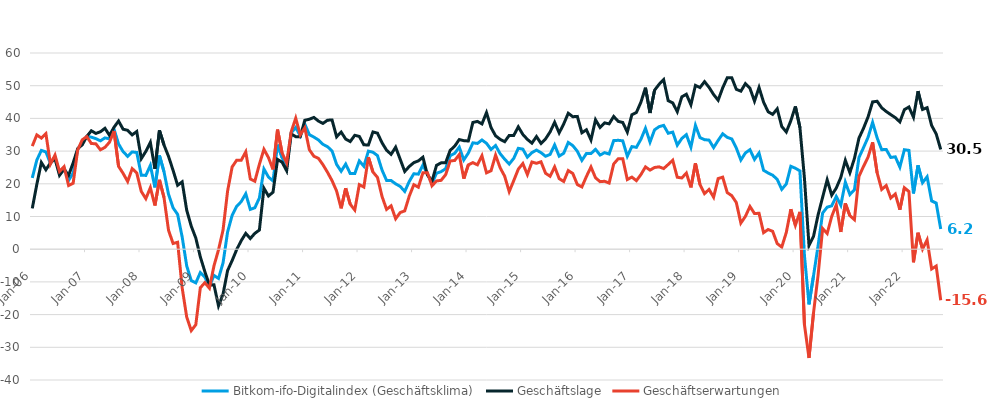
| Category | Bitkom-ifo-Digitalindex (Geschäftsklima) | Geschäftslage | Geschäftserwartungen |
|---|---|---|---|
| 2006-01-01 | 21.798 | 12.475 | 31.531 |
| 2006-02-01 | 27.246 | 19.795 | 34.949 |
| 2006-03-01 | 30.22 | 26.516 | 33.985 |
| 2006-04-01 | 29.742 | 24.293 | 35.324 |
| 2006-05-01 | 26.235 | 26.409 | 26.06 |
| 2006-06-01 | 28.215 | 27.647 | 28.783 |
| 2006-07-01 | 23.178 | 22.593 | 23.764 |
| 2006-08-01 | 24.837 | 24.431 | 25.243 |
| 2006-09-01 | 21.044 | 22.612 | 19.487 |
| 2006-10-01 | 23.27 | 26.41 | 20.173 |
| 2006-11-01 | 30.557 | 30.748 | 30.367 |
| 2006-12-01 | 32.67 | 31.902 | 33.441 |
| 2007-01-01 | 34.467 | 34.488 | 34.447 |
| 2007-02-01 | 34.269 | 36.221 | 32.333 |
| 2007-03-01 | 33.807 | 35.407 | 32.218 |
| 2007-04-01 | 33.143 | 35.918 | 30.4 |
| 2007-05-01 | 34.04 | 36.97 | 31.147 |
| 2007-06-01 | 33.769 | 34.821 | 32.722 |
| 2007-07-01 | 36.716 | 37.299 | 36.135 |
| 2007-08-01 | 32.166 | 39.199 | 25.34 |
| 2007-09-01 | 29.833 | 36.685 | 23.179 |
| 2007-10-01 | 28.4 | 36.363 | 20.705 |
| 2007-11-01 | 29.748 | 34.969 | 24.644 |
| 2007-12-01 | 29.58 | 35.993 | 23.342 |
| 2008-01-01 | 22.62 | 27.691 | 17.662 |
| 2008-02-01 | 22.567 | 29.915 | 15.454 |
| 2008-03-01 | 25.632 | 32.653 | 18.822 |
| 2008-04-01 | 18.898 | 24.578 | 13.361 |
| 2008-05-01 | 28.651 | 36.343 | 21.21 |
| 2008-06-01 | 23.702 | 31.879 | 15.813 |
| 2008-07-01 | 16.776 | 28.367 | 5.773 |
| 2008-08-01 | 12.643 | 24.124 | 1.751 |
| 2008-09-01 | 10.651 | 19.541 | 2.121 |
| 2008-10-01 | 3.747 | 20.599 | -11.817 |
| 2008-11-01 | -5.097 | 11.927 | -20.755 |
| 2008-12-01 | -9.595 | 7.057 | -24.908 |
| 2009-01-01 | -10.301 | 3.422 | -23.099 |
| 2009-02-01 | -7.13 | -2.361 | -11.785 |
| 2009-03-01 | -8.56 | -6.87 | -10.234 |
| 2009-04-01 | -11.459 | -10.992 | -11.925 |
| 2009-05-01 | -8.012 | -10.877 | -5.103 |
| 2009-06-01 | -8.952 | -17.325 | -0.195 |
| 2009-07-01 | -4.185 | -13.733 | 5.854 |
| 2009-08-01 | 5.256 | -6.537 | 17.767 |
| 2009-09-01 | 10.353 | -3.48 | 25.159 |
| 2009-10-01 | 13.109 | -0.123 | 27.216 |
| 2009-11-01 | 14.547 | 2.61 | 27.187 |
| 2009-12-01 | 16.95 | 4.835 | 29.78 |
| 2010-01-01 | 12.171 | 3.268 | 21.465 |
| 2010-02-01 | 12.673 | 4.853 | 20.793 |
| 2010-03-01 | 15.675 | 5.861 | 25.955 |
| 2010-04-01 | 24.522 | 18.649 | 30.552 |
| 2010-05-01 | 22.066 | 16.274 | 28.012 |
| 2010-06-01 | 20.885 | 17.426 | 24.399 |
| 2010-07-01 | 31.962 | 27.442 | 36.572 |
| 2010-08-01 | 28.025 | 26.616 | 29.443 |
| 2010-09-01 | 25.177 | 23.986 | 26.375 |
| 2010-10-01 | 35.56 | 35.244 | 35.878 |
| 2010-11-01 | 37.228 | 34.42 | 40.07 |
| 2010-12-01 | 34.677 | 34.408 | 34.946 |
| 2011-01-01 | 38.269 | 39.427 | 37.116 |
| 2011-02-01 | 35.034 | 39.741 | 30.419 |
| 2011-03-01 | 34.283 | 40.301 | 28.416 |
| 2011-04-01 | 33.409 | 39.175 | 27.782 |
| 2011-05-01 | 32.065 | 38.477 | 25.825 |
| 2011-06-01 | 31.345 | 39.455 | 23.509 |
| 2011-07-01 | 30.046 | 39.512 | 20.954 |
| 2011-08-01 | 25.93 | 34.371 | 17.792 |
| 2011-09-01 | 23.85 | 35.817 | 12.491 |
| 2011-10-01 | 26.031 | 33.678 | 18.634 |
| 2011-11-01 | 23.13 | 32.92 | 13.751 |
| 2011-12-01 | 23.115 | 34.834 | 11.981 |
| 2012-01-01 | 26.998 | 34.488 | 19.747 |
| 2012-02-01 | 25.369 | 31.919 | 19.004 |
| 2012-03-01 | 29.993 | 31.872 | 28.129 |
| 2012-04-01 | 29.65 | 35.857 | 23.607 |
| 2012-05-01 | 28.618 | 35.48 | 21.956 |
| 2012-06-01 | 24.197 | 32.551 | 16.144 |
| 2012-07-01 | 21.036 | 30.267 | 12.174 |
| 2012-08-01 | 21.002 | 29.015 | 13.269 |
| 2012-09-01 | 19.983 | 31.203 | 9.307 |
| 2012-10-01 | 19.201 | 27.488 | 11.216 |
| 2012-11-01 | 17.668 | 23.778 | 11.725 |
| 2012-12-01 | 20.734 | 25.304 | 16.256 |
| 2013-01-01 | 23.072 | 26.47 | 19.726 |
| 2013-02-01 | 22.95 | 27.008 | 18.964 |
| 2013-03-01 | 25.734 | 28.13 | 23.362 |
| 2013-04-01 | 23.035 | 22.673 | 23.397 |
| 2013-05-01 | 20.102 | 20.823 | 19.384 |
| 2013-06-01 | 23.255 | 25.649 | 20.885 |
| 2013-07-01 | 23.711 | 26.402 | 21.052 |
| 2013-08-01 | 24.603 | 26.446 | 22.775 |
| 2013-09-01 | 28.594 | 30.23 | 26.97 |
| 2013-10-01 | 29.314 | 31.509 | 27.14 |
| 2013-11-01 | 31.22 | 33.537 | 28.926 |
| 2013-12-01 | 27.303 | 33.191 | 21.564 |
| 2014-01-01 | 29.408 | 33.094 | 25.78 |
| 2014-02-01 | 32.528 | 38.753 | 26.466 |
| 2014-03-01 | 32.345 | 39.077 | 25.803 |
| 2014-04-01 | 33.397 | 38.314 | 28.58 |
| 2014-05-01 | 32.383 | 41.772 | 23.359 |
| 2014-06-01 | 30.501 | 37.203 | 23.99 |
| 2014-07-01 | 31.705 | 34.677 | 28.771 |
| 2014-08-01 | 29.217 | 33.609 | 24.908 |
| 2014-09-01 | 27.537 | 32.874 | 22.322 |
| 2014-10-01 | 26.041 | 34.8 | 17.61 |
| 2014-11-01 | 27.787 | 34.804 | 20.98 |
| 2014-12-01 | 30.856 | 37.419 | 24.473 |
| 2015-01-01 | 30.603 | 35.094 | 26.197 |
| 2015-02-01 | 28.138 | 33.576 | 22.827 |
| 2015-03-01 | 29.532 | 32.433 | 26.667 |
| 2015-04-01 | 30.317 | 34.446 | 26.261 |
| 2015-05-01 | 29.523 | 32.358 | 26.723 |
| 2015-06-01 | 28.422 | 33.728 | 23.236 |
| 2015-07-01 | 28.986 | 35.862 | 22.31 |
| 2015-08-01 | 31.889 | 38.814 | 25.164 |
| 2015-09-01 | 28.464 | 35.568 | 21.574 |
| 2015-10-01 | 29.344 | 38.314 | 20.712 |
| 2015-11-01 | 32.643 | 41.57 | 24.046 |
| 2015-12-01 | 31.671 | 40.519 | 23.147 |
| 2016-01-01 | 29.953 | 40.606 | 19.771 |
| 2016-02-01 | 27.175 | 35.611 | 19.041 |
| 2016-03-01 | 29.268 | 36.517 | 22.242 |
| 2016-04-01 | 29.242 | 33.417 | 25.142 |
| 2016-05-01 | 30.534 | 39.576 | 21.834 |
| 2016-06-01 | 28.792 | 37.224 | 20.659 |
| 2016-07-01 | 29.526 | 38.629 | 20.77 |
| 2016-08-01 | 29.101 | 38.338 | 20.223 |
| 2016-09-01 | 33.209 | 40.588 | 26.056 |
| 2016-10-01 | 33.301 | 39.085 | 27.656 |
| 2016-11-01 | 33.139 | 38.752 | 27.657 |
| 2016-12-01 | 28.438 | 35.813 | 21.293 |
| 2017-01-01 | 31.378 | 41.1 | 22.049 |
| 2017-02-01 | 31.154 | 41.817 | 20.961 |
| 2017-03-01 | 33.634 | 44.963 | 22.83 |
| 2017-04-01 | 36.97 | 49.391 | 25.168 |
| 2017-05-01 | 32.755 | 41.654 | 24.185 |
| 2017-06-01 | 36.506 | 48.614 | 24.988 |
| 2017-07-01 | 37.474 | 50.434 | 25.184 |
| 2017-08-01 | 37.871 | 51.858 | 24.66 |
| 2017-09-01 | 35.456 | 45.417 | 25.9 |
| 2017-10-01 | 35.811 | 44.743 | 27.205 |
| 2017-11-01 | 31.814 | 42.057 | 22.004 |
| 2017-12-01 | 33.864 | 46.597 | 21.789 |
| 2018-01-01 | 35.025 | 47.39 | 23.278 |
| 2018-02-01 | 31.192 | 44.18 | 18.896 |
| 2018-03-01 | 37.876 | 50.089 | 26.26 |
| 2018-04-01 | 34.13 | 49.437 | 19.763 |
| 2018-05-01 | 33.496 | 51.241 | 17.004 |
| 2018-06-01 | 33.356 | 49.49 | 18.266 |
| 2018-07-01 | 31.069 | 47.303 | 15.9 |
| 2018-08-01 | 33.277 | 45.565 | 21.604 |
| 2018-09-01 | 35.293 | 49.346 | 22.031 |
| 2018-10-01 | 34.206 | 52.43 | 17.299 |
| 2018-11-01 | 33.703 | 52.431 | 16.363 |
| 2018-12-01 | 30.923 | 48.893 | 14.251 |
| 2019-01-01 | 27.272 | 48.332 | 7.999 |
| 2019-02-01 | 29.441 | 50.639 | 10.036 |
| 2019-03-01 | 30.432 | 49.207 | 13.072 |
| 2019-04-01 | 27.45 | 45.284 | 10.913 |
| 2019-05-01 | 29.415 | 49.456 | 10.984 |
| 2019-06-01 | 24.127 | 44.97 | 5.057 |
| 2019-07-01 | 23.304 | 42.036 | 6.023 |
| 2019-08-01 | 22.632 | 41.23 | 5.467 |
| 2019-09-01 | 21.363 | 42.925 | 1.715 |
| 2019-10-01 | 18.312 | 37.528 | 0.65 |
| 2019-11-01 | 19.942 | 35.845 | 5.111 |
| 2019-12-01 | 25.352 | 39.279 | 12.235 |
| 2020-01-01 | 24.76 | 43.661 | 7.325 |
| 2020-02-01 | 23.944 | 37.232 | 11.4 |
| 2020-03-01 | -2.004 | 21.633 | -23.119 |
| 2020-04-01 | -16.868 | 1.127 | -33.254 |
| 2020-05-01 | -8.071 | 3.952 | -19.385 |
| 2020-06-01 | 1.07 | 10.48 | -7.919 |
| 2020-07-01 | 11.059 | 15.896 | 6.331 |
| 2020-08-01 | 12.851 | 21.224 | 4.796 |
| 2020-09-01 | 13.258 | 16.527 | 10.039 |
| 2020-10-01 | 16.124 | 18.684 | 13.593 |
| 2020-11-01 | 13.446 | 21.934 | 5.283 |
| 2020-12-01 | 20.496 | 27.181 | 14.007 |
| 2021-01-01 | 16.722 | 23.393 | 10.249 |
| 2021-02-01 | 18.186 | 27.749 | 9.024 |
| 2021-03-01 | 28.047 | 33.978 | 22.267 |
| 2021-04-01 | 31.056 | 36.968 | 25.292 |
| 2021-05-01 | 34.21 | 40.441 | 28.14 |
| 2021-06-01 | 38.785 | 45.047 | 32.684 |
| 2021-07-01 | 34.038 | 45.239 | 23.349 |
| 2021-08-01 | 30.424 | 43.248 | 18.275 |
| 2021-09-01 | 30.51 | 42.105 | 19.47 |
| 2021-10-01 | 28.049 | 41.157 | 15.654 |
| 2021-11-01 | 28.257 | 40.229 | 16.881 |
| 2021-12-01 | 25.105 | 38.934 | 12.077 |
| 2022-01-01 | 30.425 | 42.673 | 18.794 |
| 2022-02-01 | 30.215 | 43.501 | 17.654 |
| 2022-03-01 | 17.051 | 40.365 | -4.002 |
| 2022-04-01 | 25.648 | 48.336 | 5.033 |
| 2022-05-01 | 20.343 | 42.735 | 0.017 |
| 2022-06-01 | 22.149 | 43.272 | 2.859 |
| 2022-07-01 | 14.783 | 37.827 | -6.027 |
| 2022-08-01 | 14.105 | 35.268 | -5.155 |
| 2022-09-01 | 6.17 | 30.498 | -15.59 |